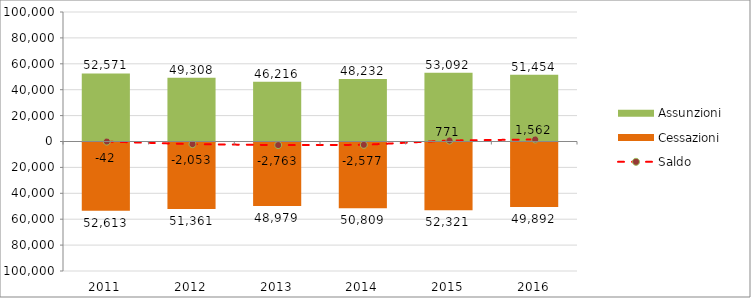
| Category | Assunzioni | Cessazioni |
|---|---|---|
| 2011.0 | 52571 | -52613 |
| 2012.0 | 49308 | -51361 |
| 2013.0 | 46216 | -48979 |
| 2014.0 | 48232 | -50809 |
| 2015.0 | 53092 | -52321 |
| 2016.0 | 51454 | -49892 |